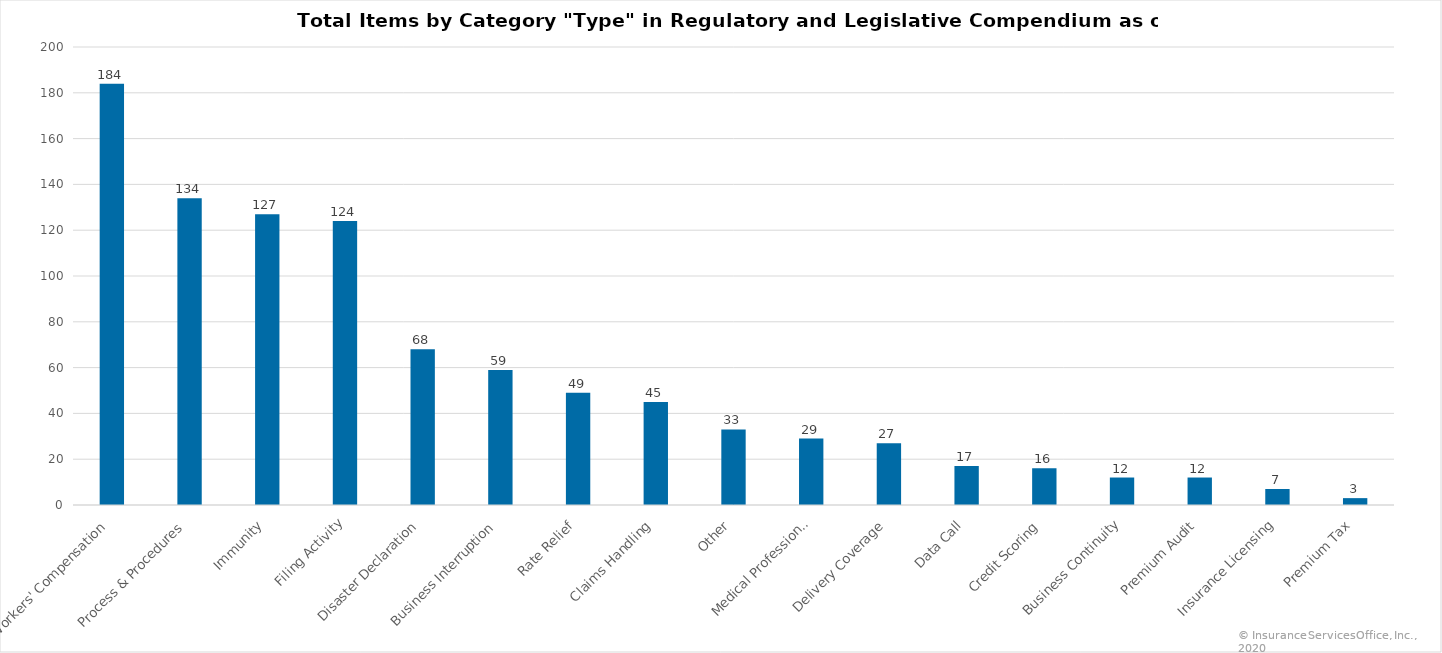
| Category | Count |
|---|---|
| Workers' Compensation | 184 |
| Process & Procedures | 134 |
| Immunity | 127 |
| Filing Activity | 124 |
| Disaster Declaration | 68 |
| Business Interruption | 59 |
| Rate Relief | 49 |
| Claims Handling | 45 |
| Other | 33 |
| Medical Professional | 29 |
| Delivery Coverage | 27 |
| Data Call | 17 |
| Credit Scoring | 16 |
| Business Continuity | 12 |
| Premium Audit | 12 |
| Insurance Licensing | 7 |
| Premium Tax | 3 |